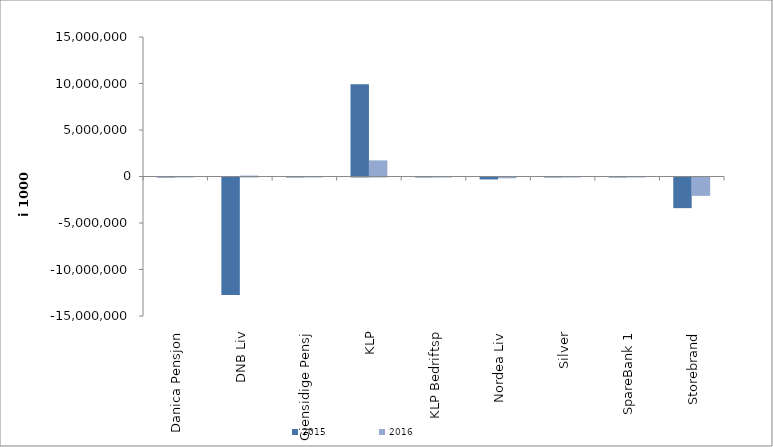
| Category | 2015 | 2016 |
|---|---|---|
| 0 | -5423.009 | 3164.315 |
| 1 | -12638250 | 98448 |
| 2 | 10295.83 | 5465.622 |
| 3 | 9909451.654 | 1734144.823 |
| 4 | 434 | -1716 |
| 5 | -211079.902 | -84367.383 |
| 6 | 11620.272 | -4800.856 |
| 7 | 1718.845 | 6068.306 |
| 8 | -3295312.484 | -1973854.843 |